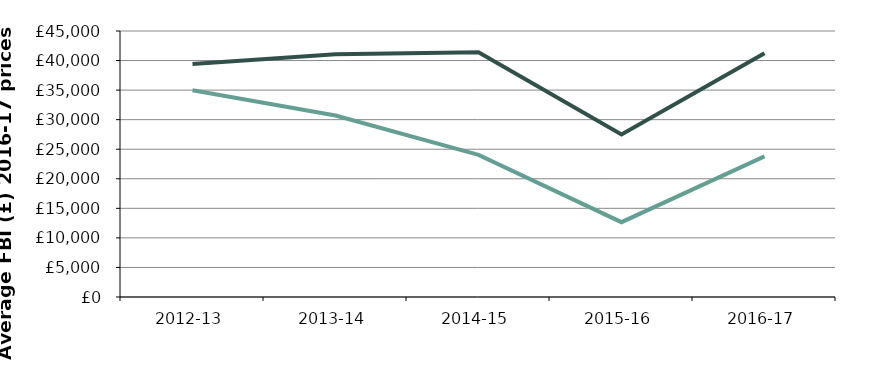
| Category | Average FBI of farms with diversified activity | Average FBI of farms without diversified activity |
|---|---|---|
| 2012-13 | 39417.871 | 34985.033 |
| 2013-14 | 41061.42 | 30712.31 |
| 2014-15 | 41388.214 | 24032.962 |
| 2015-16 | 27479.052 | 12656.857 |
| 2016-17 | 41237 | 23797 |